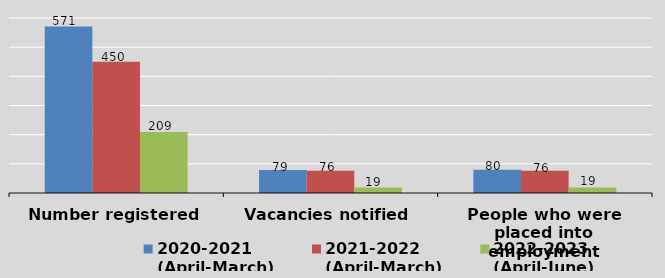
| Category | 2020-2021
(April-March) | 2021-2022
(April-March) | 2022-2023
(April-June) |
|---|---|---|---|
| Number registered | 571 | 450 | 209 |
| Vacancies notified | 79 | 76 | 19 |
| People who were placed into employment | 80 | 76 | 19 |